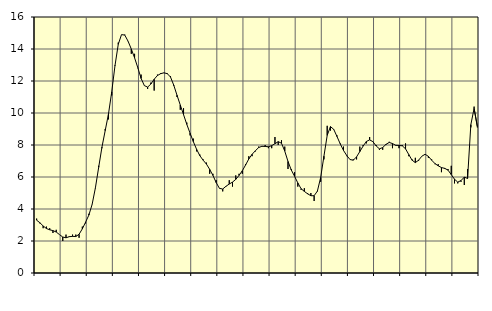
| Category | Piggar | Series 1 |
|---|---|---|
| nan | 3.4 | 3.3 |
| 87.0 | 3.1 | 3.14 |
| 87.0 | 2.8 | 2.94 |
| 87.0 | 2.9 | 2.78 |
| nan | 2.8 | 2.7 |
| 88.0 | 2.5 | 2.65 |
| 88.0 | 2.7 | 2.56 |
| 88.0 | 2.4 | 2.4 |
| nan | 2 | 2.25 |
| 89.0 | 2.4 | 2.2 |
| 89.0 | 2.3 | 2.27 |
| 89.0 | 2.4 | 2.29 |
| nan | 2.4 | 2.28 |
| 90.0 | 2.2 | 2.42 |
| 90.0 | 2.9 | 2.76 |
| 90.0 | 3.1 | 3.18 |
| nan | 3.7 | 3.62 |
| 91.0 | 4.3 | 4.29 |
| 91.0 | 5.3 | 5.32 |
| 91.0 | 6.7 | 6.6 |
| nan | 7.8 | 7.86 |
| 92.0 | 9 | 8.9 |
| 92.0 | 9.6 | 9.93 |
| 92.0 | 11.1 | 11.32 |
| nan | 13 | 12.96 |
| 93.0 | 14.4 | 14.29 |
| 93.0 | 14.9 | 14.9 |
| 93.0 | 14.9 | 14.87 |
| nan | 14.5 | 14.49 |
| 94.0 | 13.7 | 14 |
| 94.0 | 13.7 | 13.45 |
| 94.0 | 12.8 | 12.83 |
| nan | 12.4 | 12.16 |
| 95.0 | 11.7 | 11.71 |
| 95.0 | 11.5 | 11.62 |
| 95.0 | 11.9 | 11.81 |
| nan | 11.4 | 12.11 |
| 96.0 | 12.4 | 12.34 |
| 96.0 | 12.5 | 12.46 |
| 96.0 | 12.5 | 12.51 |
| nan | 12.5 | 12.46 |
| 97.0 | 12.3 | 12.25 |
| 97.0 | 11.7 | 11.74 |
| 97.0 | 11 | 11.11 |
| nan | 10.2 | 10.5 |
| 98.0 | 10.3 | 9.9 |
| 98.0 | 9.4 | 9.29 |
| 98.0 | 8.6 | 8.74 |
| nan | 8.4 | 8.21 |
| 99.0 | 7.6 | 7.73 |
| 99.0 | 7.4 | 7.33 |
| 99.0 | 7.1 | 7.05 |
| nan | 6.9 | 6.81 |
| 0.0 | 6.2 | 6.48 |
| 0.0 | 6.2 | 6.1 |
| 0.0 | 5.8 | 5.65 |
| nan | 5.3 | 5.29 |
| 1.0 | 5.1 | 5.25 |
| 1.0 | 5.4 | 5.42 |
| 1.0 | 5.8 | 5.56 |
| nan | 5.4 | 5.68 |
| 2.0 | 6.1 | 5.85 |
| 2.0 | 6.2 | 6.1 |
| 2.0 | 6.2 | 6.39 |
| nan | 6.8 | 6.75 |
| 3.0 | 7.3 | 7.13 |
| 3.0 | 7.3 | 7.42 |
| 3.0 | 7.6 | 7.64 |
| nan | 7.9 | 7.84 |
| 4.0 | 7.9 | 7.92 |
| 4.0 | 8 | 7.91 |
| 4.0 | 7.8 | 7.89 |
| nan | 7.8 | 7.96 |
| 5.0 | 8.5 | 8.08 |
| 5.0 | 8 | 8.21 |
| 5.0 | 8.3 | 8.11 |
| nan | 7.9 | 7.62 |
| 6.0 | 6.5 | 6.97 |
| 6.0 | 6.5 | 6.44 |
| 6.0 | 6.3 | 6.05 |
| nan | 5.4 | 5.63 |
| 7.0 | 5.2 | 5.27 |
| 7.0 | 5.3 | 5.1 |
| 7.0 | 5 | 4.95 |
| nan | 5 | 4.83 |
| 8.0 | 4.5 | 4.83 |
| 8.0 | 5.1 | 5.12 |
| 8.0 | 5.7 | 5.97 |
| nan | 7.1 | 7.3 |
| 9.0 | 9.2 | 8.6 |
| 9.0 | 8.9 | 9.15 |
| 9.0 | 9 | 8.98 |
| nan | 8.6 | 8.53 |
| 10.0 | 8.1 | 8.07 |
| 10.0 | 7.9 | 7.66 |
| 10.0 | 7.3 | 7.34 |
| nan | 7.1 | 7.09 |
| 11.0 | 7.1 | 7.05 |
| 11.0 | 7.1 | 7.26 |
| 11.0 | 7.9 | 7.59 |
| nan | 8 | 7.93 |
| 12.0 | 8.1 | 8.22 |
| 12.0 | 8.5 | 8.32 |
| 12.0 | 8.2 | 8.21 |
| nan | 8 | 7.94 |
| 13.0 | 7.7 | 7.76 |
| 13.0 | 7.7 | 7.84 |
| 13.0 | 8 | 8.04 |
| nan | 8.2 | 8.16 |
| 14.0 | 7.8 | 8.09 |
| 14.0 | 8 | 7.98 |
| 14.0 | 7.8 | 7.97 |
| nan | 8 | 7.95 |
| 15.0 | 8.1 | 7.76 |
| 15.0 | 7.3 | 7.4 |
| 15.0 | 7.1 | 7.05 |
| nan | 7.2 | 6.9 |
| 16.0 | 7 | 7.05 |
| 16.0 | 7.3 | 7.3 |
| 16.0 | 7.4 | 7.42 |
| nan | 7.2 | 7.29 |
| 17.0 | 7.1 | 7.05 |
| 17.0 | 6.8 | 6.84 |
| 17.0 | 6.8 | 6.7 |
| nan | 6.3 | 6.59 |
| 18.0 | 6.5 | 6.54 |
| 18.0 | 6.5 | 6.43 |
| 18.0 | 6.7 | 6.15 |
| nan | 5.6 | 5.86 |
| 19.0 | 5.6 | 5.68 |
| 19.0 | 5.7 | 5.78 |
| 19.0 | 5.5 | 5.99 |
| nan | 6.5 | 5.91 |
| 20.0 | 9.1 | 9.27 |
| 20.0 | 10.4 | 10.29 |
| 20.0 | 9.1 | 9.14 |